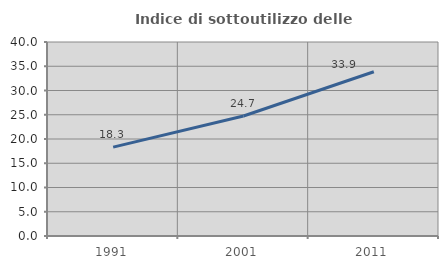
| Category | Indice di sottoutilizzo delle abitazioni  |
|---|---|
| 1991.0 | 18.321 |
| 2001.0 | 24.744 |
| 2011.0 | 33.87 |